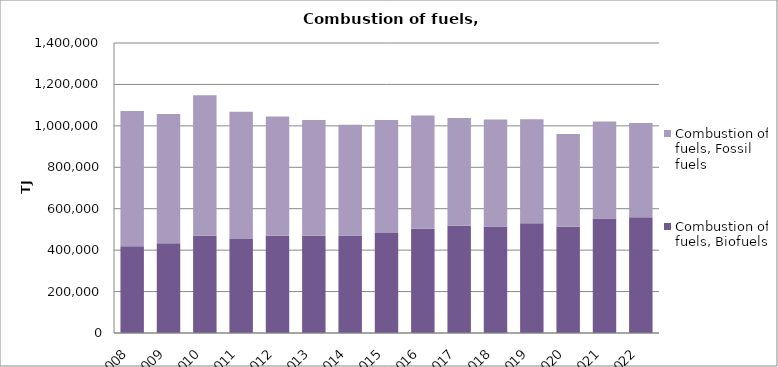
| Category | Combustion of fuels, Biofuels | Combustion of fuels, Fossil fuels |
|---|---|---|
| 2008 | 419334.859 | 652644.092 |
| 2009 | 432688.505 | 624505.673 |
| 2010 | 469547.338 | 678120.06 |
| 2011 | 453395.002 | 615103.626 |
| 2012 | 469136.98 | 576221.803 |
| 2013 | 469400.804 | 558603.936 |
| 2014 | 470982.487 | 533972.186 |
| 2015 | 483153.842 | 545426.236 |
| 2016 | 503264.134 | 546840.327 |
| 2017 | 517974.332 | 519791.97 |
| 2018 | 513704.114 | 516775.76 |
| 2019 | 529760.364 | 501916.656 |
| 2020 | 513085.704 | 447638.856 |
| 2021 | 553081.686 | 468192.916 |
| 2022 | 558758.709 | 454787.681 |